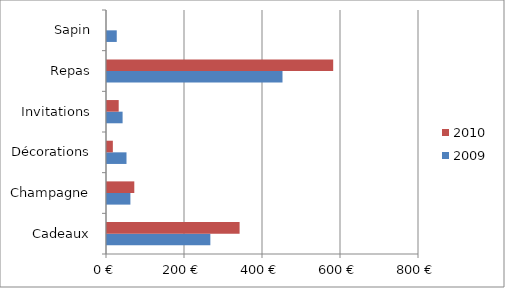
| Category | 2009 | 2010 |
|---|---|---|
| Cadeaux | 265 | 340 |
| Champagne | 60 | 70 |
| Décorations | 50 | 15 |
| Invitations | 40 | 30 |
| Repas | 450 | 580 |
| Sapin | 25 | 0 |